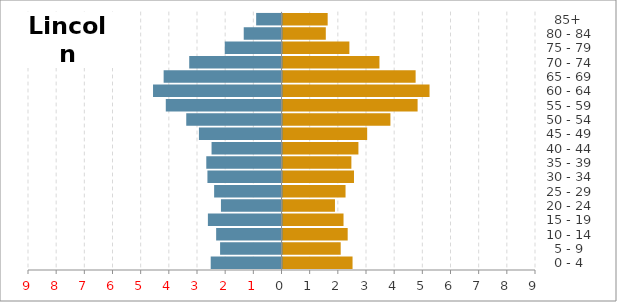
| Category | Female | Male |
|---|---|---|
|   0 - 4 | 2.487 | -2.513 |
|   5 - 9 | 2.066 | -2.18 |
| 10 - 14 | 2.314 | -2.32 |
| 15 - 19 | 2.167 | -2.613 |
| 20 - 24 | 1.863 | -2.15 |
| 25 - 29 | 2.238 | -2.392 |
| 30 - 34 | 2.538 | -2.63 |
| 35 - 39 | 2.445 | -2.67 |
| 40 - 44 | 2.695 | -2.483 |
| 45 - 49 | 3.006 | -2.932 |
| 50 - 54 | 3.831 | -3.382 |
| 55 - 59 | 4.796 | -4.108 |
| 60 - 64 | 5.22 | -4.561 |
| 65 - 69 | 4.726 | -4.184 |
| 70 - 74 | 3.442 | -3.276 |
| 75 - 79 | 2.374 | -2.014 |
| 80 - 84 | 1.537 | -1.341 |
|   85+ | 1.604 | -0.9 |